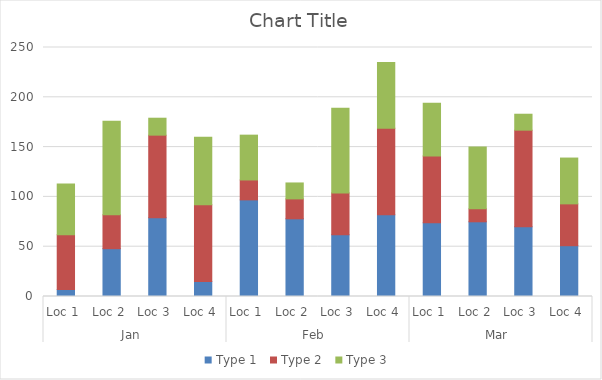
| Category | Type 1  | Type 2  | Type 3  |
|---|---|---|---|
| 0 | 7 | 55 | 51 |
| 1 | 48 | 34 | 94 |
| 2 | 79 | 83 | 17 |
| 3 | 15 | 77 | 68 |
| 4 | 97 | 20 | 45 |
| 5 | 78 | 20 | 16 |
| 6 | 62 | 42 | 85 |
| 7 | 82 | 87 | 66 |
| 8 | 74 | 67 | 53 |
| 9 | 75 | 13 | 62 |
| 10 | 70 | 97 | 16 |
| 11 | 51 | 42 | 46 |